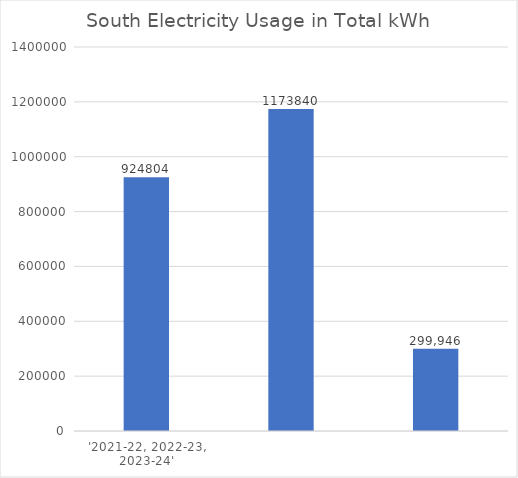
| Category | Series 0 |
|---|---|
| 0 | 924804 |
| 1 | 1173840 |
| 2 | 299946 |